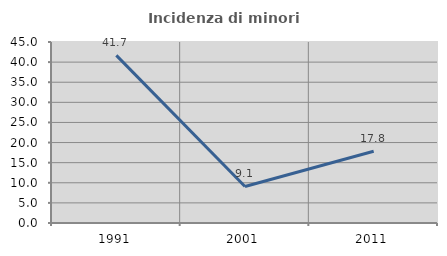
| Category | Incidenza di minori stranieri |
|---|---|
| 1991.0 | 41.667 |
| 2001.0 | 9.091 |
| 2011.0 | 17.842 |